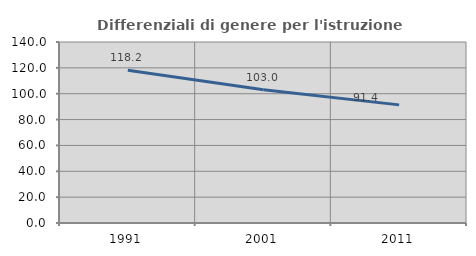
| Category | Differenziali di genere per l'istruzione superiore |
|---|---|
| 1991.0 | 118.179 |
| 2001.0 | 102.985 |
| 2011.0 | 91.364 |